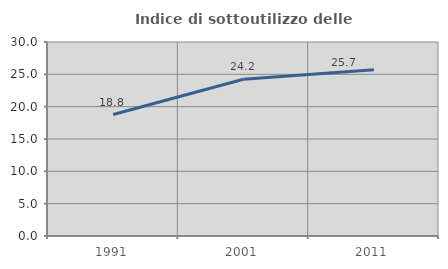
| Category | Indice di sottoutilizzo delle abitazioni  |
|---|---|
| 1991.0 | 18.787 |
| 2001.0 | 24.247 |
| 2011.0 | 25.713 |